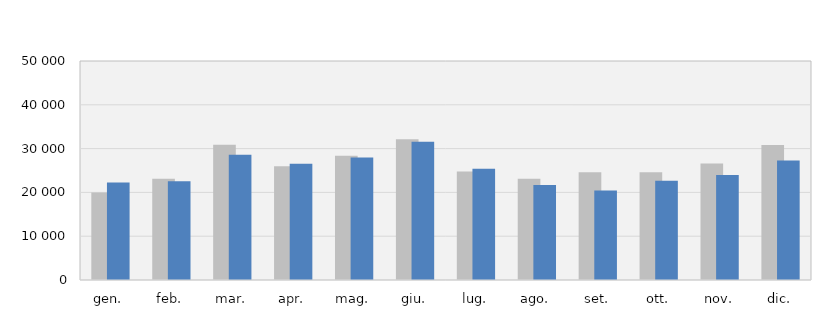
| Category | 2017 | 2018 |
|---|---|---|
| gen. | 19994 | 22258 |
| feb. | 23123 | 22536 |
| mar. | 30892 | 28581 |
| apr. | 25995 | 26558 |
| mag. | 28375 | 27942 |
| giu. | 32141 | 31536 |
| lug. | 24798 | 25379 |
| ago. | 23111 | 21680 |
| set. | 24606 | 20462 |
| ott. | 24614 | 22666 |
| nov. | 26587 | 23986 |
| dic. | 30796 | 27303 |